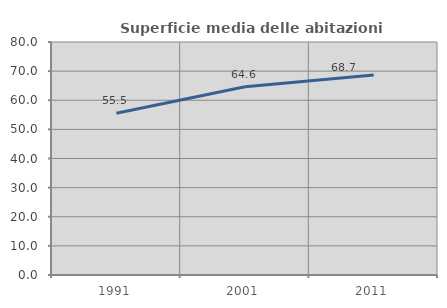
| Category | Superficie media delle abitazioni occupate |
|---|---|
| 1991.0 | 55.548 |
| 2001.0 | 64.633 |
| 2011.0 | 68.659 |